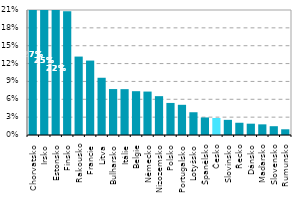
| Category | Series 0 |
|---|---|
| Chorvatsko | 0.27 |
| Irsko | 0.25 |
| Estonsko | 0.225 |
| Finsko | 0.208 |
| Rakousko | 0.132 |
| Francie | 0.125 |
| Litva | 0.096 |
| Bulharsko | 0.077 |
| Itálie | 0.077 |
| Belgie | 0.074 |
| Německo | 0.073 |
| Nizozemsko | 0.065 |
| Polsko | 0.054 |
| Portugalsko | 0.051 |
| Lotyšsko | 0.038 |
| Španělsko | 0.029 |
| Česko | 0.029 |
| Slovinsko | 0.025 |
| Řecko | 0.021 |
| Dánsko | 0.019 |
| Maďarsko | 0.018 |
| Slovensko | 0.015 |
| Rumunsko | 0.01 |